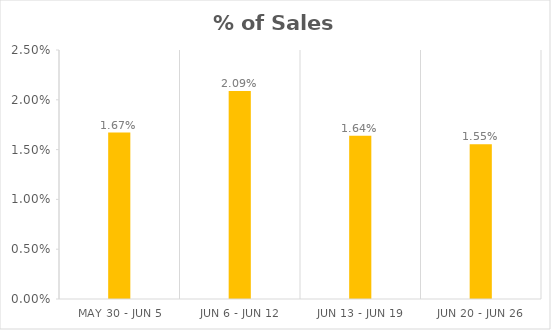
| Category | % of Sales Wasted |
|---|---|
| May 30 - Jun 5 | 0.017 |
| Jun 6 - Jun 12 | 0.021 |
| Jun 13 - Jun 19 | 0.016 |
| Jun 20 - Jun 26 | 0.016 |